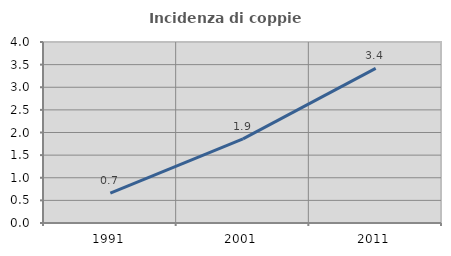
| Category | Incidenza di coppie miste |
|---|---|
| 1991.0 | 0.66 |
| 2001.0 | 1.859 |
| 2011.0 | 3.417 |